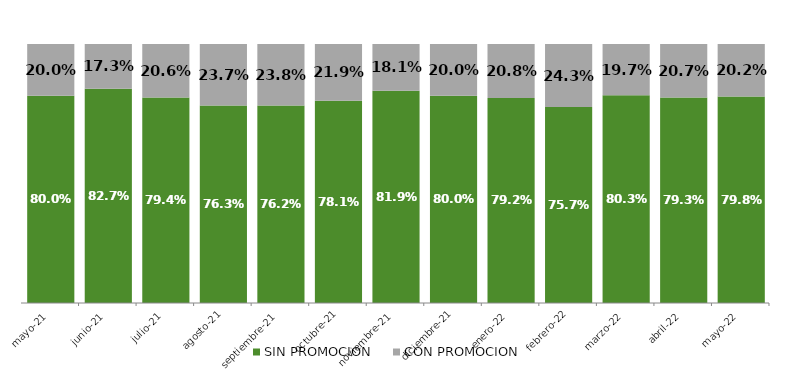
| Category | SIN PROMOCION   | CON PROMOCION   |
|---|---|---|
| 2021-05-01 | 0.8 | 0.2 |
| 2021-06-01 | 0.827 | 0.173 |
| 2021-07-01 | 0.794 | 0.206 |
| 2021-08-01 | 0.763 | 0.237 |
| 2021-09-01 | 0.762 | 0.238 |
| 2021-10-01 | 0.781 | 0.219 |
| 2021-11-01 | 0.819 | 0.181 |
| 2021-12-01 | 0.8 | 0.2 |
| 2022-01-01 | 0.792 | 0.208 |
| 2022-02-01 | 0.757 | 0.243 |
| 2022-03-01 | 0.803 | 0.197 |
| 2022-04-01 | 0.793 | 0.207 |
| 2022-05-01 | 0.798 | 0.202 |